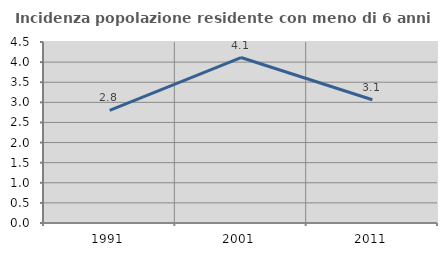
| Category | Incidenza popolazione residente con meno di 6 anni |
|---|---|
| 1991.0 | 2.801 |
| 2001.0 | 4.114 |
| 2011.0 | 3.065 |